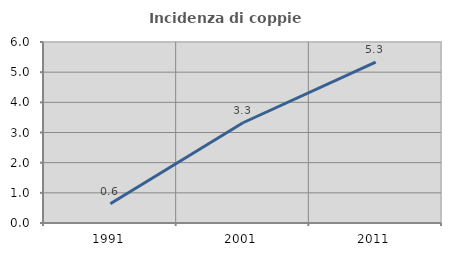
| Category | Incidenza di coppie miste |
|---|---|
| 1991.0 | 0.639 |
| 2001.0 | 3.323 |
| 2011.0 | 5.329 |